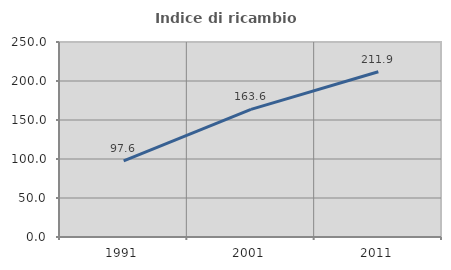
| Category | Indice di ricambio occupazionale  |
|---|---|
| 1991.0 | 97.633 |
| 2001.0 | 163.566 |
| 2011.0 | 211.905 |